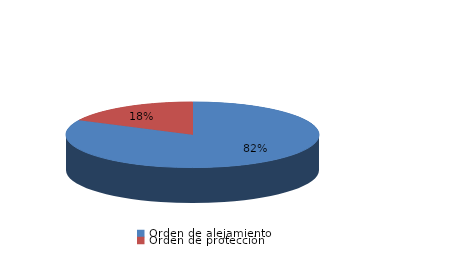
| Category | Series 0 |
|---|---|
| Orden de alejamiento | 28 |
| Orden de protección | 6 |